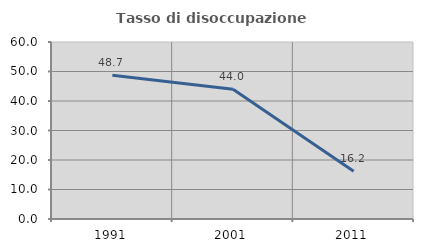
| Category | Tasso di disoccupazione giovanile  |
|---|---|
| 1991.0 | 48.739 |
| 2001.0 | 44 |
| 2011.0 | 16.216 |